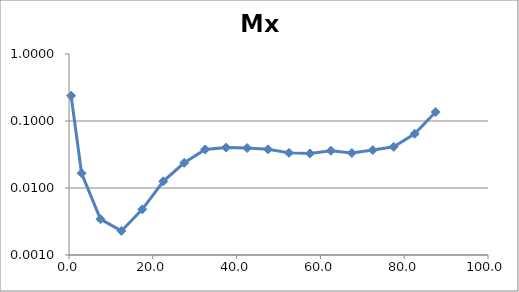
| Category | Mx |
|---|---|
| 0.5 | 0.238 |
| 3.0 | 0.017 |
| 7.5 | 0.003 |
| 12.5 | 0.002 |
| 17.5 | 0.005 |
| 22.5 | 0.013 |
| 27.5 | 0.024 |
| 32.5 | 0.038 |
| 37.5 | 0.04 |
| 42.5 | 0.039 |
| 47.5 | 0.038 |
| 52.5 | 0.033 |
| 57.5 | 0.033 |
| 62.5 | 0.036 |
| 67.5 | 0.033 |
| 72.5 | 0.037 |
| 77.5 | 0.041 |
| 82.5 | 0.064 |
| 87.5 | 0.136 |